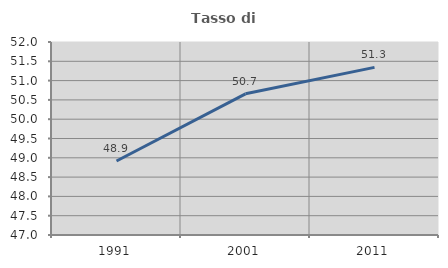
| Category | Tasso di occupazione   |
|---|---|
| 1991.0 | 48.917 |
| 2001.0 | 50.657 |
| 2011.0 | 51.343 |